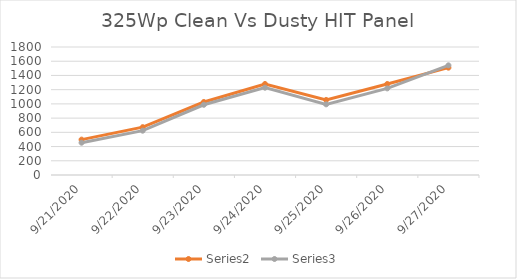
| Category | Series 0 | Series 1 | Series 2 | Series 3 |
|---|---|---|---|---|
| 9/21/20 |  | 497.5 | 454 |  |
| 9/22/20 |  | 672.5 | 623.25 |  |
| 9/23/20 |  | 1026.5 | 987.5 |  |
| 9/24/20 |  | 1279.75 | 1228 |  |
| 9/25/20 |  | 1055.5 | 993.75 |  |
| 9/26/20 |  | 1279.75 | 1218 |  |
| 9/27/20 |  | 1509.5 | 1542.25 |  |